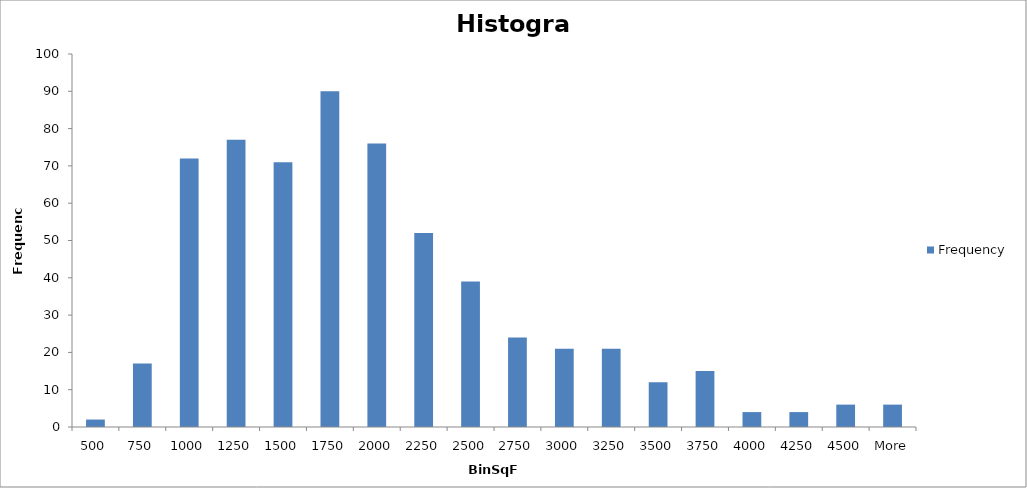
| Category | Frequency |
|---|---|
| 500 | 2 |
| 750 | 17 |
| 1000 | 72 |
| 1250 | 77 |
| 1500 | 71 |
| 1750 | 90 |
| 2000 | 76 |
| 2250 | 52 |
| 2500 | 39 |
| 2750 | 24 |
| 3000 | 21 |
| 3250 | 21 |
| 3500 | 12 |
| 3750 | 15 |
| 4000 | 4 |
| 4250 | 4 |
| 4500 | 6 |
| More | 6 |